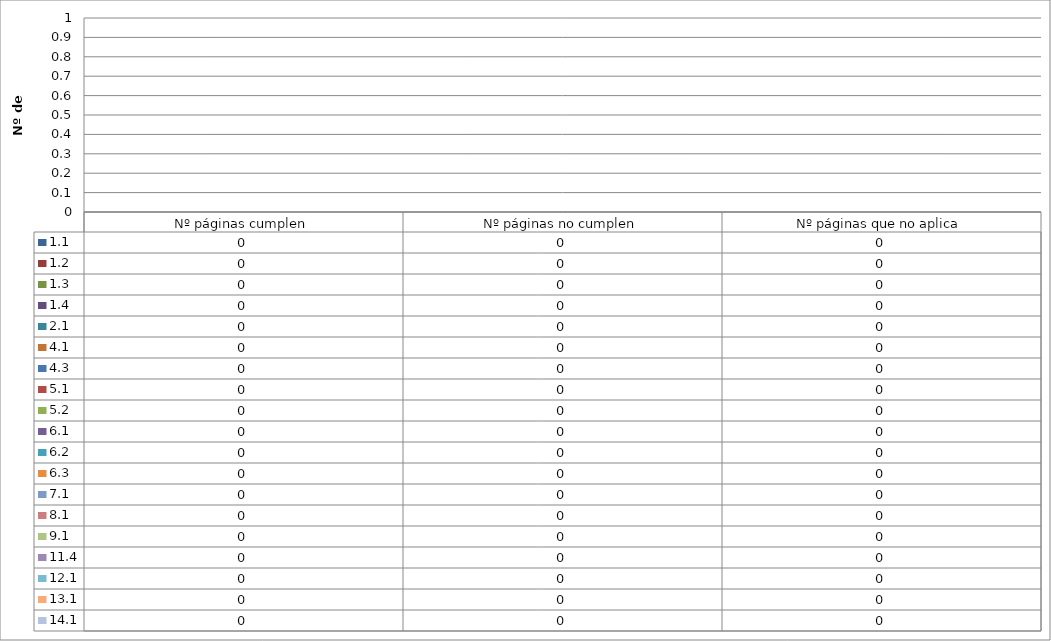
| Category | 1.1  | 1.2 | 1.3  | 1.4  | 2.1  | 4.1  | 4.3 | 5.1  | 5.2  | 6.1  | 6.2 | 6.3  | 7.1  | 8.1  | 9.1  | 11.4  | 12.1  | 13.1  | 14.1 |
|---|---|---|---|---|---|---|---|---|---|---|---|---|---|---|---|---|---|---|---|
| Nº páginas cumplen | 0 | 0 | 0 | 0 | 0 | 0 | 0 | 0 | 0 | 0 | 0 | 0 | 0 | 0 | 0 | 0 | 0 | 0 | 0 |
| Nº páginas no cumplen | 0 | 0 | 0 | 0 | 0 | 0 | 0 | 0 | 0 | 0 | 0 | 0 | 0 | 0 | 0 | 0 | 0 | 0 | 0 |
| Nº páginas que no aplica | 0 | 0 | 0 | 0 | 0 | 0 | 0 | 0 | 0 | 0 | 0 | 0 | 0 | 0 | 0 | 0 | 0 | 0 | 0 |